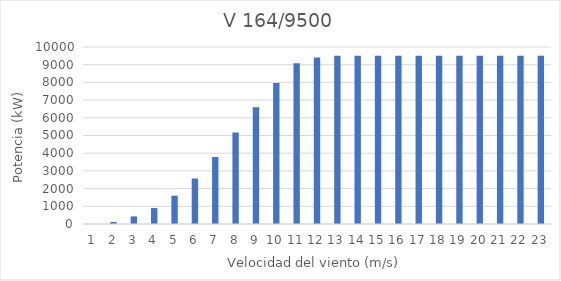
| Category | V 164/9500 |
|---|---|
| 0 | 0 |
| 1 | 115 |
| 2 | 430 |
| 3 | 900 |
| 4 | 1600 |
| 5 | 2570 |
| 6 | 3784 |
| 7 | 5170 |
| 8 | 6600 |
| 9 | 7960 |
| 10 | 9080 |
| 11 | 9410 |
| 12 | 9500 |
| 13 | 9500 |
| 14 | 9500 |
| 15 | 9500 |
| 16 | 9500 |
| 17 | 9500 |
| 18 | 9500 |
| 19 | 9500 |
| 20 | 9500 |
| 21 | 9500 |
| 22 | 9500 |